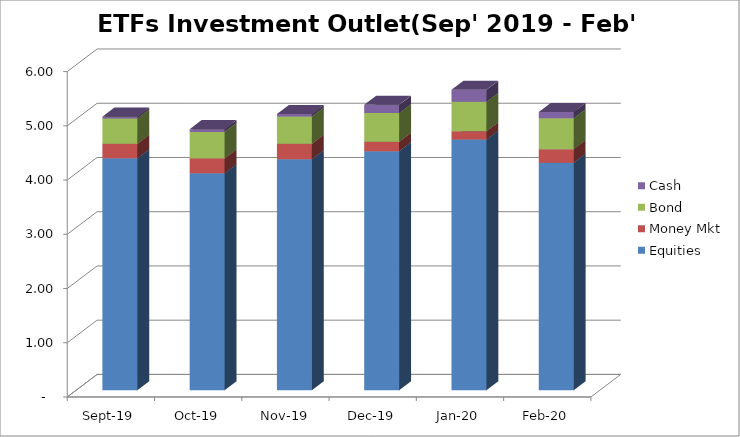
| Category | Equities | Money Mkt | Bond | Cash |
|---|---|---|---|---|
| 2019-09-01 | 4275169260.79 | 268651365.85 | 465259955.14 | 35225532.29 |
| 2019-10-01 | 3998481766.57 | 276775288.51 | 488154889.65 | 50379881.56 |
| 2019-11-01 | 4258053610.08 | 285466996.9 | 503321320.85 | 44585809.67 |
| 2019-12-01 | 4408225444.33 | 171857896.38 | 529473292.36 | 151803547.97 |
| 2020-01-01 | 4620730446.19 | 152280847.14 | 544105837.98 | 221324761.76 |
| 2020-02-01 | 4193271504.52 | 252081379.79 | 568973079.15 | 116675921.8 |